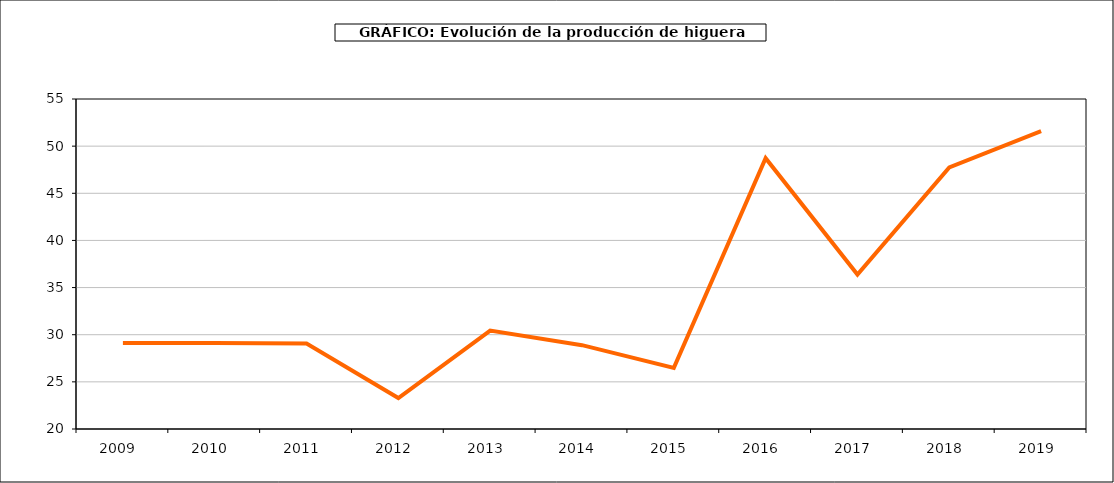
| Category | producción higuera |
|---|---|
| 2009.0 | 29.12 |
| 2010.0 | 29.12 |
| 2011.0 | 29.071 |
| 2012.0 | 23.285 |
| 2013.0 | 30.434 |
| 2014.0 | 28.893 |
| 2015.0 | 26.479 |
| 2016.0 | 48.718 |
| 2017.0 | 36.38 |
| 2018.0 | 47.75 |
| 2019.0 | 51.598 |